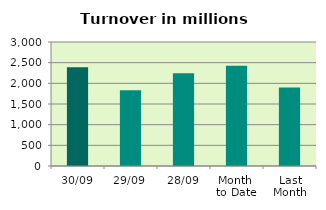
| Category | Series 0 |
|---|---|
| 30/09 | 2386.478 |
| 29/09 | 1831.924 |
| 28/09 | 2244.468 |
| Month 
to Date | 2424.403 |
| Last
Month | 1896.825 |